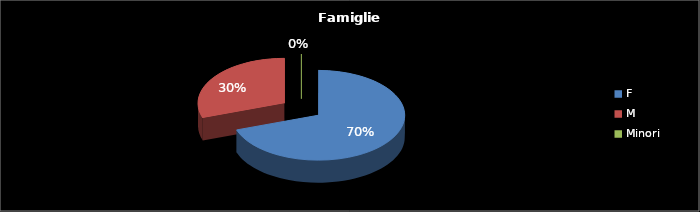
| Category | Series 0 |
|---|---|
| F | 69 |
| M | 30 |
| Minori | 0 |